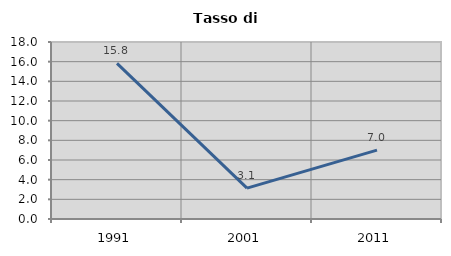
| Category | Tasso di disoccupazione   |
|---|---|
| 1991.0 | 15.823 |
| 2001.0 | 3.135 |
| 2011.0 | 7 |